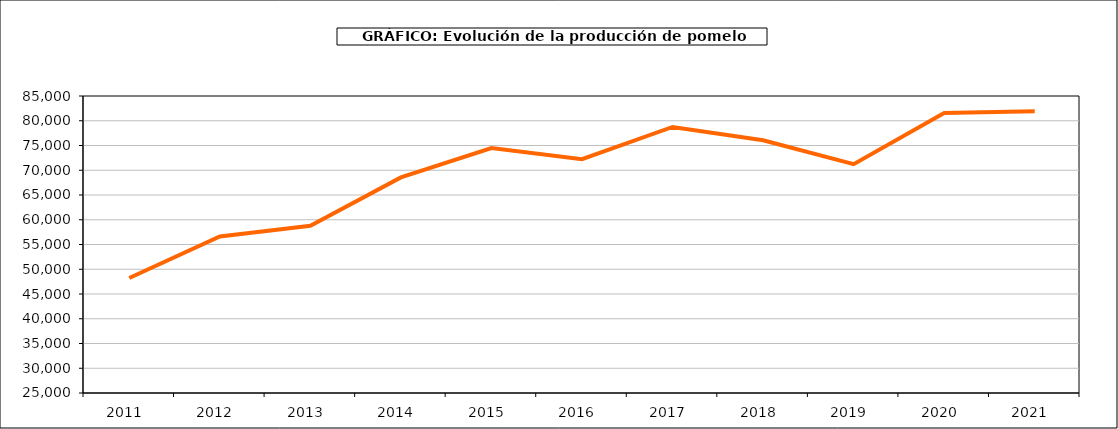
| Category | producción |
|---|---|
| 2011.0 | 48231 |
| 2012.0 | 56634 |
| 2013.0 | 58770 |
| 2014.0 | 68545 |
| 2015.0 | 74470 |
| 2016.0 | 72236 |
| 2017.0 | 78752 |
| 2018.0 | 76044 |
| 2019.0 | 71217 |
| 2020.0 | 81556 |
| 2021.0 | 81932 |